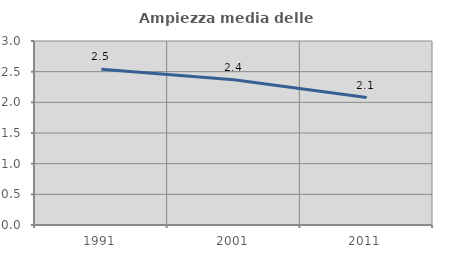
| Category | Ampiezza media delle famiglie |
|---|---|
| 1991.0 | 2.538 |
| 2001.0 | 2.369 |
| 2011.0 | 2.077 |